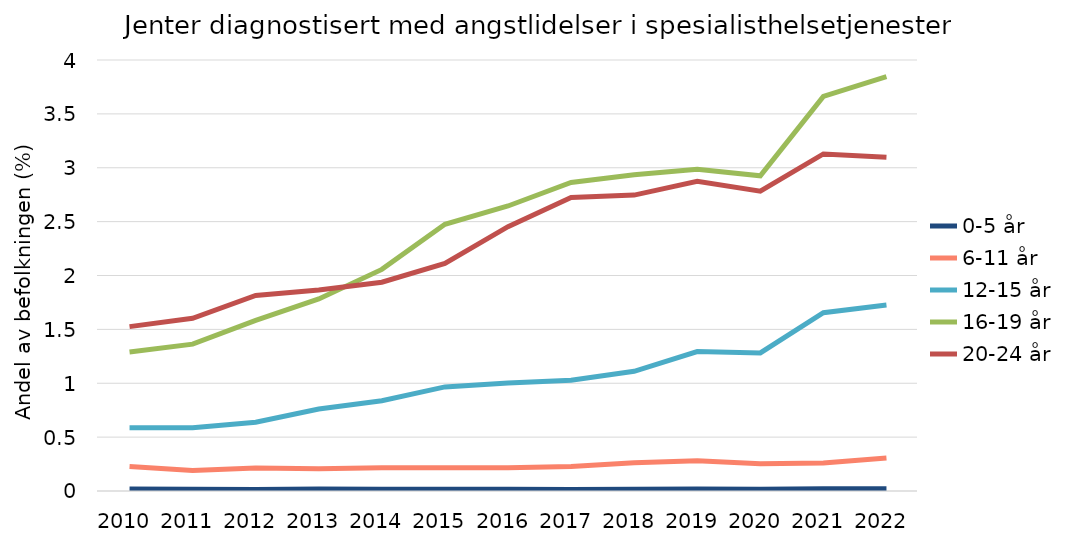
| Category | 0-5 år | 6-11 år | 12-15 år | 16-19 år | 20-24 år |
|---|---|---|---|---|---|
| 2010.0 | 0.019 | 0.228 | 0.587 | 1.29 | 1.526 |
| 2011.0 | 0.016 | 0.191 | 0.587 | 1.363 | 1.602 |
| 2012.0 | 0.015 | 0.213 | 0.638 | 1.584 | 1.815 |
| 2013.0 | 0.018 | 0.206 | 0.761 | 1.782 | 1.866 |
| 2014.0 | 0.016 | 0.215 | 0.838 | 2.057 | 1.938 |
| 2015.0 | 0.016 | 0.216 | 0.966 | 2.476 | 2.113 |
| 2016.0 | 0.017 | 0.217 | 1.003 | 2.645 | 2.453 |
| 2017.0 | 0.014 | 0.227 | 1.029 | 2.863 | 2.724 |
| 2018.0 | 0.016 | 0.261 | 1.111 | 2.936 | 2.746 |
| 2019.0 | 0.019 | 0.281 | 1.294 | 2.985 | 2.873 |
| 2020.0 | 0.015 | 0.252 | 1.281 | 2.925 | 2.783 |
| 2021.0 | 0.02 | 0.259 | 1.655 | 3.663 | 3.128 |
| 2022.0 | 0.022 | 0.305 | 1.726 | 3.846 | 3.098 |